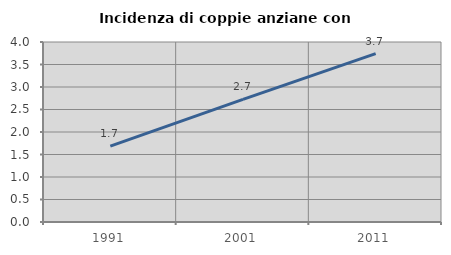
| Category | Incidenza di coppie anziane con figli |
|---|---|
| 1991.0 | 1.687 |
| 2001.0 | 2.725 |
| 2011.0 | 3.742 |